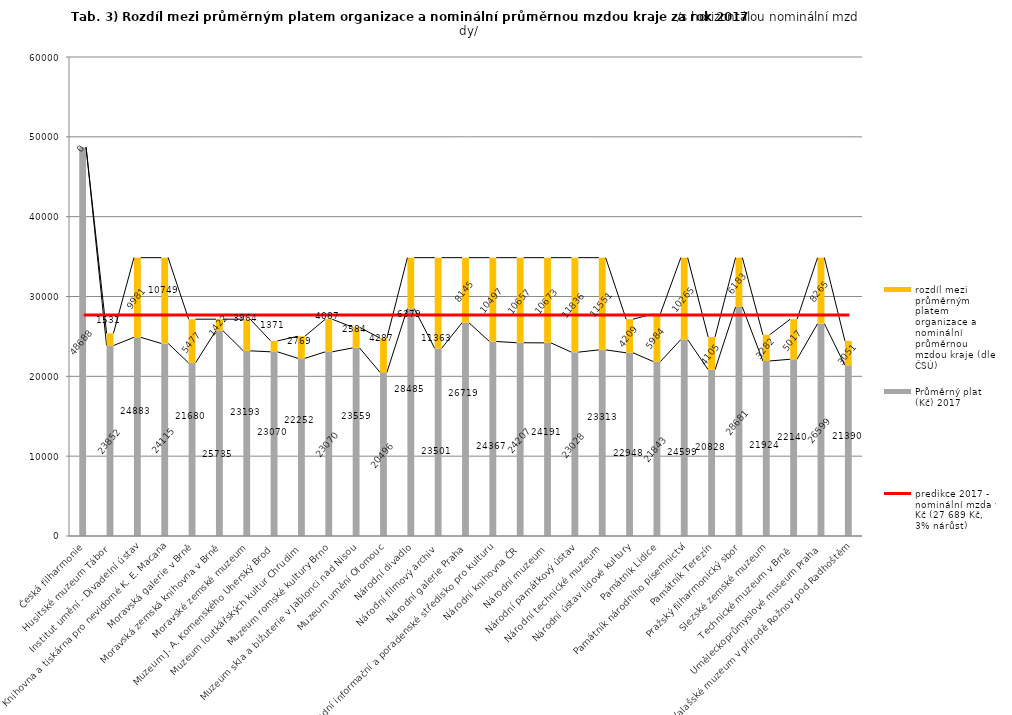
| Category | Průměrný plat (Kč) 2017 | rozdíl mezi průměrným platem organizace a nominální průměrnou mzdou kraje (dle ČSÚ) |
|---|---|---|
| Česká filharmonie | 48688 | 0 |
| Husitské muzeum Tábor | 23852 | 1531 |
| Institut umění - Divadelní ústav | 24883 | 9981 |
| Knihovna a tiskárna pro nevidomé K. E. Macana | 24115 | 10749 |
| Moravská galerie v Brně | 21680 | 5477 |
| Moravská zemská knihovna v Brně | 25735 | 1422 |
| Moravské zemské muzeum | 23193 | 3964 |
| Muzeum J. A. Komenského Uherský Brod | 23070 | 1371 |
| Muzeum loutkářských kultur Chrudim | 22252 | 2769 |
| Muzeum romské kultury Brno | 23070 | 4087 |
| Muzeum skla a bižuterie v Jablonci nad Nisou | 23559 | 2584 |
| Muzeum umění Olomouc | 20496 | 4287 |
| Národní divadlo | 28485 | 6379 |
| Národní filmový archiv | 23501 | 11363 |
| Národní galerie Praha | 26719 | 8145 |
| Národní informační a poradenské středisko pro kulturu | 24367 | 10497 |
| Národní knihovna ČR | 24207 | 10657 |
| Národní muzeum | 24191 | 10673 |
| Národní památkový ústav | 23028 | 11836 |
| Národní technické muzeum | 23313 | 11551 |
| Národní ústav lidové kultury | 22948 | 4209 |
| Památník Lidice | 21843 | 5984 |
| Památník národního písemnictví | 24599 | 10265 |
| Památník Terezín | 20828 | 4105 |
| Pražský filharmonický sbor | 28681 | 6183 |
| Slezské zemské muzeum | 21924 | 3282 |
| Technické muzeum v Brně  | 22140 | 5017 |
| Uměleckoprůmyslové museum Praha | 26599 | 8265 |
| Valašské muzeum v přírodě Rožnov pod Radhoštěm | 21390 | 3051 |